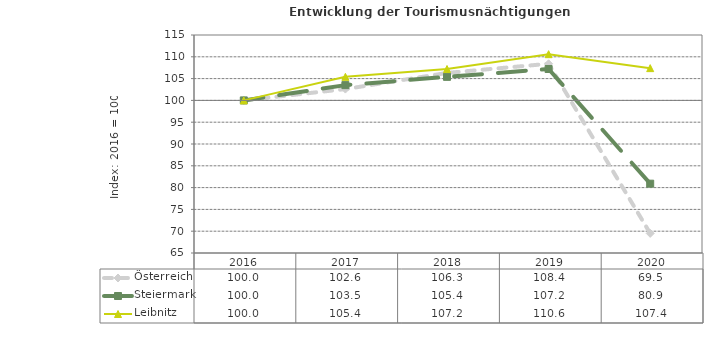
| Category | Österreich | Steiermark | Leibnitz |
|---|---|---|---|
| 2020.0 | 69.5 | 80.9 | 107.4 |
| 2019.0 | 108.4 | 107.2 | 110.6 |
| 2018.0 | 106.3 | 105.4 | 107.2 |
| 2017.0 | 102.6 | 103.5 | 105.4 |
| 2016.0 | 100 | 100 | 100 |